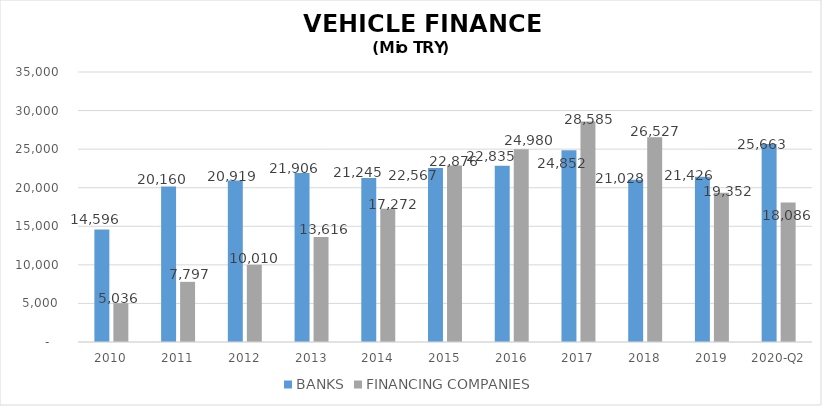
| Category | BANKS | FINANCING COMPANIES |
|---|---|---|
| 2010 | 14596 | 5035.89 |
| 2011 | 20160 | 7796.854 |
| 2012 | 20919 | 10009.755 |
| 2013 | 21906 | 13616.036 |
| 2014 | 21245 | 17271.844 |
| 2015 | 22567 | 22875.563 |
| 2016 | 22835 | 24980.231 |
| 2017 | 24852 | 28584.938 |
| 2018 | 21028 | 26527.133 |
| 2019 | 21426.2 | 19352.327 |
| 2020-Q2 | 25662.91 | 18086.409 |